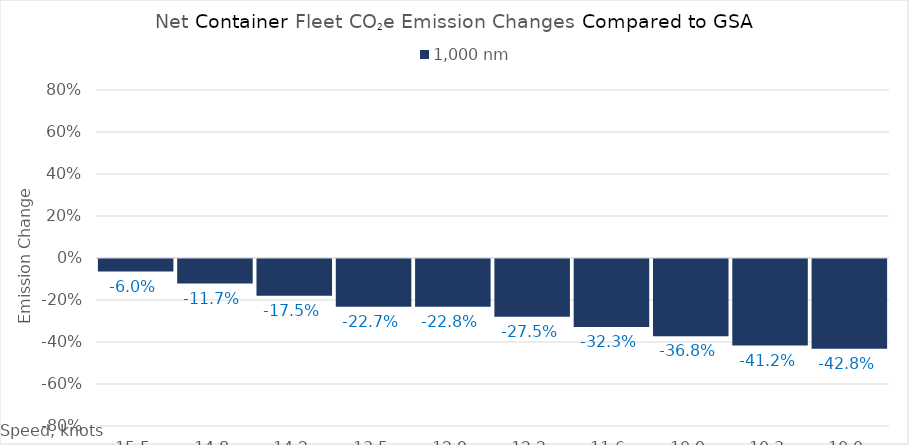
| Category | 1,000 |
|---|---|
| 15.450000000000001 | -0.06 |
| 14.8 | -0.117 |
| 14.15 | -0.175 |
| 13.5 | -0.227 |
| 12.85 | -0.228 |
| 12.2 | -0.275 |
| 11.549999999999999 | -0.323 |
| 10.899999999999999 | -0.368 |
| 10.249999999999998 | -0.412 |
| 10.0 | -0.428 |